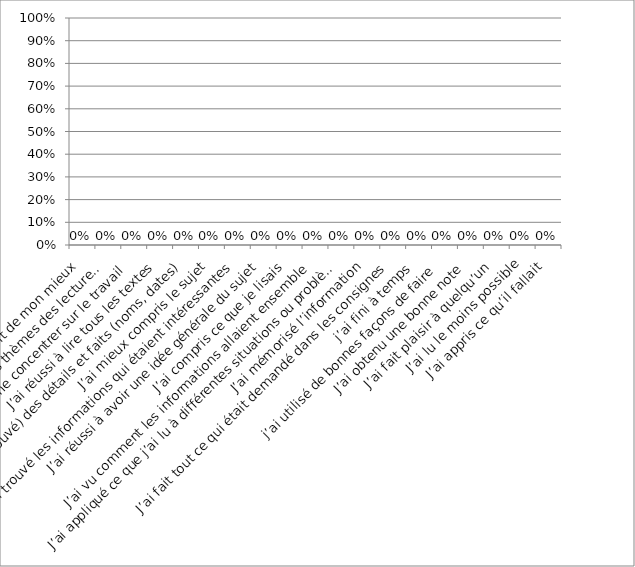
| Category | Series 0 |
|---|---|
| J’ai fait de mon mieux | 0 |
| Jj’ai trouvé les idées importantes ou les thèmes des lectures  | 0 |
| j’ai réussi à bien me concentrer sur le travail | 0 |
| J’ai réussi à lire tous les textes | 0 |
| Je me souviens (j'ai trouvé) des détails et faits (noms, dates) | 0 |
| J’ai mieux compris le sujet | 0 |
| J’ai trouvé les informations qui étaient intéressantes | 0 |
| J’ai réussi à avoir une idée générale du sujet | 0 |
| J’ai compris ce que je lisais | 0 |
| J’ai vu comment les informations allaient ensemble | 0 |
| J’ai appliqué ce que j’ai lu à différentes situations ou problèmes | 0 |
| J’ai mémorisé l’information | 0 |
| J’ai fait tout ce qui était demandé dans les consignes | 0 |
| j’ai fini à temps  | 0 |
| j’ai utilisé de bonnes façons de faire  | 0 |
| J’ai obtenu une bonne note | 0 |
| J’ai fait plaisir à quelqu’un | 0 |
| J’ai lu le moins possible | 0 |
| J’ai appris ce qu’il fallait | 0 |